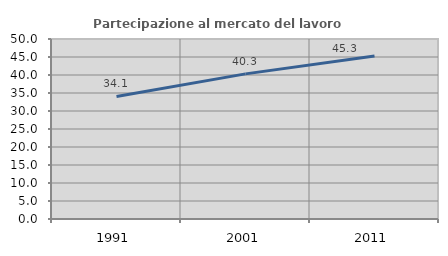
| Category | Partecipazione al mercato del lavoro  femminile |
|---|---|
| 1991.0 | 34.052 |
| 2001.0 | 40.314 |
| 2011.0 | 45.302 |